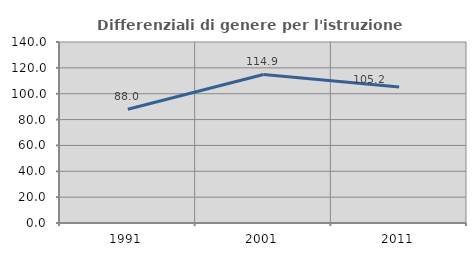
| Category | Differenziali di genere per l'istruzione superiore |
|---|---|
| 1991.0 | 88.028 |
| 2001.0 | 114.911 |
| 2011.0 | 105.217 |